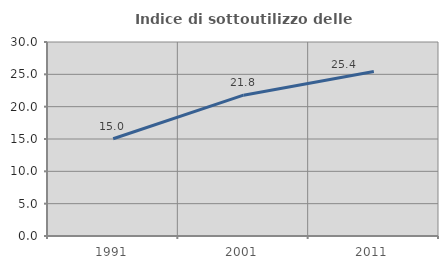
| Category | Indice di sottoutilizzo delle abitazioni  |
|---|---|
| 1991.0 | 15.042 |
| 2001.0 | 21.779 |
| 2011.0 | 25.442 |